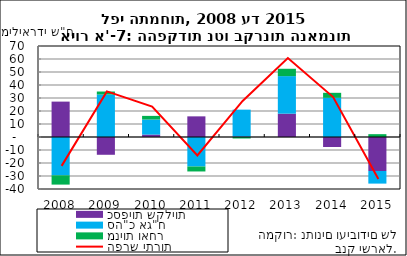
| Category | כספיות שקליות | סה"כ אג"ח | מניות ואחר |
|---|---|---|---|
| 2008-12-31 | 27220.585 | -29478.466 | -7137.446 |
| 2009-12-31 | -13675.089 | 32685.111 | 2294.279 |
| 2010-12-31 | 1873.775 | 11591.795 | 2781.204 |
| 2011-12-31 | 15881.257 | -22695.328 | -3814.668 |
| 2012-12-31 | 377.573 | 20661.628 | -1144.456 |
| 2013-12-31 | 17945.594 | 28889.303 | 5650.828 |
| 2014-12-31 | -7698.316 | 30140.878 | 3848.107 |
| 2015-12-31 | -26169.368 | -9679.697 | 2178.88 |